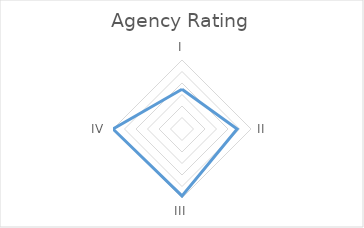
| Category | Series 0 |
|---|---|
| I | 1.727 |
| II | 2.4 |
| III | 2.909 |
| IV | 3 |